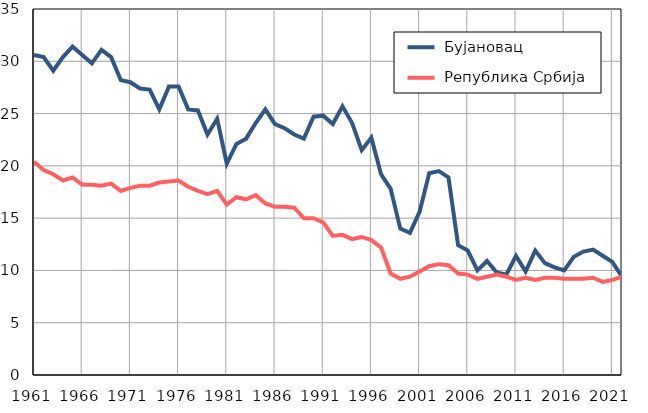
| Category |  Бујановац |  Република Србија |
|---|---|---|
| 1961.0 | 30.6 | 20.4 |
| 1962.0 | 30.4 | 19.6 |
| 1963.0 | 29.1 | 19.2 |
| 1964.0 | 30.4 | 18.6 |
| 1965.0 | 31.4 | 18.9 |
| 1966.0 | 30.6 | 18.2 |
| 1967.0 | 29.8 | 18.2 |
| 1968.0 | 31.1 | 18.1 |
| 1969.0 | 30.4 | 18.3 |
| 1970.0 | 28.2 | 17.6 |
| 1971.0 | 28 | 17.9 |
| 1972.0 | 27.4 | 18.1 |
| 1973.0 | 27.3 | 18.1 |
| 1974.0 | 25.4 | 18.4 |
| 1975.0 | 27.6 | 18.5 |
| 1976.0 | 27.6 | 18.6 |
| 1977.0 | 25.4 | 18 |
| 1978.0 | 25.3 | 17.6 |
| 1979.0 | 23 | 17.3 |
| 1980.0 | 24.5 | 17.6 |
| 1981.0 | 20.2 | 16.3 |
| 1982.0 | 22.1 | 17 |
| 1983.0 | 22.6 | 16.8 |
| 1984.0 | 24.1 | 17.2 |
| 1985.0 | 25.4 | 16.4 |
| 1986.0 | 24 | 16.1 |
| 1987.0 | 23.6 | 16.1 |
| 1988.0 | 23 | 16 |
| 1989.0 | 22.6 | 15 |
| 1990.0 | 24.7 | 15 |
| 1991.0 | 24.8 | 14.6 |
| 1992.0 | 24 | 13.3 |
| 1993.0 | 25.7 | 13.4 |
| 1994.0 | 24.1 | 13 |
| 1995.0 | 21.5 | 13.2 |
| 1996.0 | 22.7 | 12.9 |
| 1997.0 | 19.2 | 12.2 |
| 1998.0 | 17.8 | 9.7 |
| 1999.0 | 14 | 9.2 |
| 2000.0 | 13.6 | 9.4 |
| 2001.0 | 15.6 | 9.9 |
| 2002.0 | 19.3 | 10.4 |
| 2003.0 | 19.5 | 10.6 |
| 2004.0 | 18.9 | 10.5 |
| 2005.0 | 12.4 | 9.7 |
| 2006.0 | 11.9 | 9.6 |
| 2007.0 | 10 | 9.2 |
| 2008.0 | 10.9 | 9.4 |
| 2009.0 | 9.8 | 9.6 |
| 2010.0 | 9.6 | 9.4 |
| 2011.0 | 11.4 | 9.1 |
| 2012.0 | 9.9 | 9.3 |
| 2013.0 | 11.9 | 9.1 |
| 2014.0 | 10.7 | 9.3 |
| 2015.0 | 10.3 | 9.3 |
| 2016.0 | 10 | 9.2 |
| 2017.0 | 11.3 | 9.2 |
| 2018.0 | 11.8 | 9.2 |
| 2019.0 | 12 | 9.3 |
| 2020.0 | 11.4 | 8.9 |
| 2021.0 | 10.8 | 9.1 |
| 2022.0 | 9.4 | 9.4 |